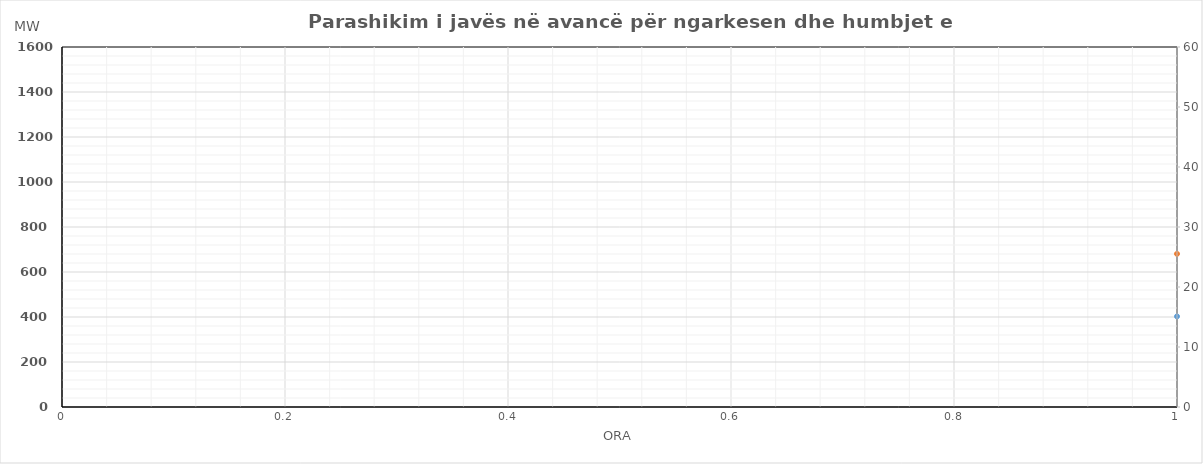
| Category | Ngarkesa (MWh) |
|---|---|
| 0 | 680.63 |
| 1 | 595.63 |
| 2 | 557.24 |
| 3 | 545.87 |
| 4 | 557.82 |
| 5 | 640.97 |
| 6 | 866.47 |
| 7 | 1154.56 |
| 8 | 1220.6 |
| 9 | 1199.55 |
| 10 | 1166.82 |
| 11 | 1148.03 |
| 12 | 1140.43 |
| 13 | 1147.22 |
| 14 | 1171.78 |
| 15 | 1218.71 |
| 16 | 1333.46 |
| 17 | 1437.12 |
| 18 | 1436.34 |
| 19 | 1417.14 |
| 20 | 1372.15 |
| 21 | 1262.77 |
| 22 | 1074.13 |
| 23 | 862.88 |
| 24 | 713.87 |
| 25 | 639.76 |
| 26 | 606.23 |
| 27 | 602.51 |
| 28 | 603.81 |
| 29 | 656.62 |
| 30 | 784.9 |
| 31 | 992.63 |
| 32 | 1123.6 |
| 33 | 1169.32 |
| 34 | 1139.53 |
| 35 | 1125.33 |
| 36 | 1131.53 |
| 37 | 1159.32 |
| 38 | 1171.37 |
| 39 | 1220.09 |
| 40 | 1357.45 |
| 41 | 1473.13 |
| 42 | 1486.34 |
| 43 | 1476.17 |
| 44 | 1418.77 |
| 45 | 1281.89 |
| 46 | 1104.63 |
| 47 | 890.88 |
| 48 | 693.78 |
| 49 | 611.4 |
| 50 | 573.22 |
| 51 | 560.36 |
| 52 | 570.08 |
| 53 | 638.23 |
| 54 | 784.33 |
| 55 | 1023.05 |
| 56 | 1199.34 |
| 57 | 1235.53 |
| 58 | 1196.98 |
| 59 | 1180.67 |
| 60 | 1180.86 |
| 61 | 1219.48 |
| 62 | 1234.36 |
| 63 | 1273.06 |
| 64 | 1365.03 |
| 65 | 1433.87 |
| 66 | 1369.48 |
| 67 | 1343.03 |
| 68 | 1285.76 |
| 69 | 1171.39 |
| 70 | 1014.49 |
| 71 | 832.2 |
| 72 | 616.78 |
| 73 | 540.85 |
| 74 | 515.73 |
| 75 | 529.23 |
| 76 | 528.55 |
| 77 | 574.14 |
| 78 | 750.65 |
| 79 | 988.92 |
| 80 | 1081.77 |
| 81 | 1093.21 |
| 82 | 1051.4 |
| 83 | 1046.71 |
| 84 | 1091.01 |
| 85 | 1133.91 |
| 86 | 1151.18 |
| 87 | 1154.1 |
| 88 | 1217.96 |
| 89 | 1275.69 |
| 90 | 1271.59 |
| 91 | 1255.72 |
| 92 | 1218.99 |
| 93 | 1123.87 |
| 94 | 972.26 |
| 95 | 778.28 |
| 96 | 683.87 |
| 97 | 602.66 |
| 98 | 565.43 |
| 99 | 554.71 |
| 100 | 567.11 |
| 101 | 640.02 |
| 102 | 825 |
| 103 | 1061.83 |
| 104 | 1121.59 |
| 105 | 1127.92 |
| 106 | 1102.23 |
| 107 | 1078.23 |
| 108 | 1082.73 |
| 109 | 1079.02 |
| 110 | 1103.97 |
| 111 | 1118.1 |
| 112 | 1187.95 |
| 113 | 1252.13 |
| 114 | 1280.24 |
| 115 | 1261.27 |
| 116 | 1219.07 |
| 117 | 1113.19 |
| 118 | 968.03 |
| 119 | 787.88 |
| 120 | 703.01 |
| 121 | 623.53 |
| 122 | 590.53 |
| 123 | 580.26 |
| 124 | 593.87 |
| 125 | 671.9 |
| 126 | 864.21 |
| 127 | 1142 |
| 128 | 1211.14 |
| 129 | 1233.12 |
| 130 | 1204.48 |
| 131 | 1135.12 |
| 132 | 1141.8 |
| 133 | 1074.9 |
| 134 | 1093.75 |
| 135 | 1157.43 |
| 136 | 1226.25 |
| 137 | 1290.31 |
| 138 | 1269.72 |
| 139 | 1246.35 |
| 140 | 1195.64 |
| 141 | 1081.14 |
| 142 | 920.65 |
| 143 | 789.74 |
| 144 | 670.21 |
| 145 | 602.1 |
| 146 | 569.23 |
| 147 | 551.39 |
| 148 | 568.49 |
| 149 | 643.75 |
| 150 | 864.66 |
| 151 | 1142.81 |
| 152 | 1238.72 |
| 153 | 1248.46 |
| 154 | 1221.43 |
| 155 | 1212.59 |
| 156 | 1223.12 |
| 157 | 1265.23 |
| 158 | 1284.25 |
| 159 | 1272.08 |
| 160 | 1311.72 |
| 161 | 1368.06 |
| 162 | 1371.65 |
| 163 | 1350.27 |
| 164 | 1307.38 |
| 165 | 1206.39 |
| 166 | 1033.87 |
| 167 | 840.05 |